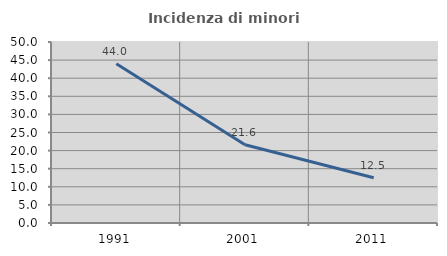
| Category | Incidenza di minori stranieri |
|---|---|
| 1991.0 | 44 |
| 2001.0 | 21.622 |
| 2011.0 | 12.5 |